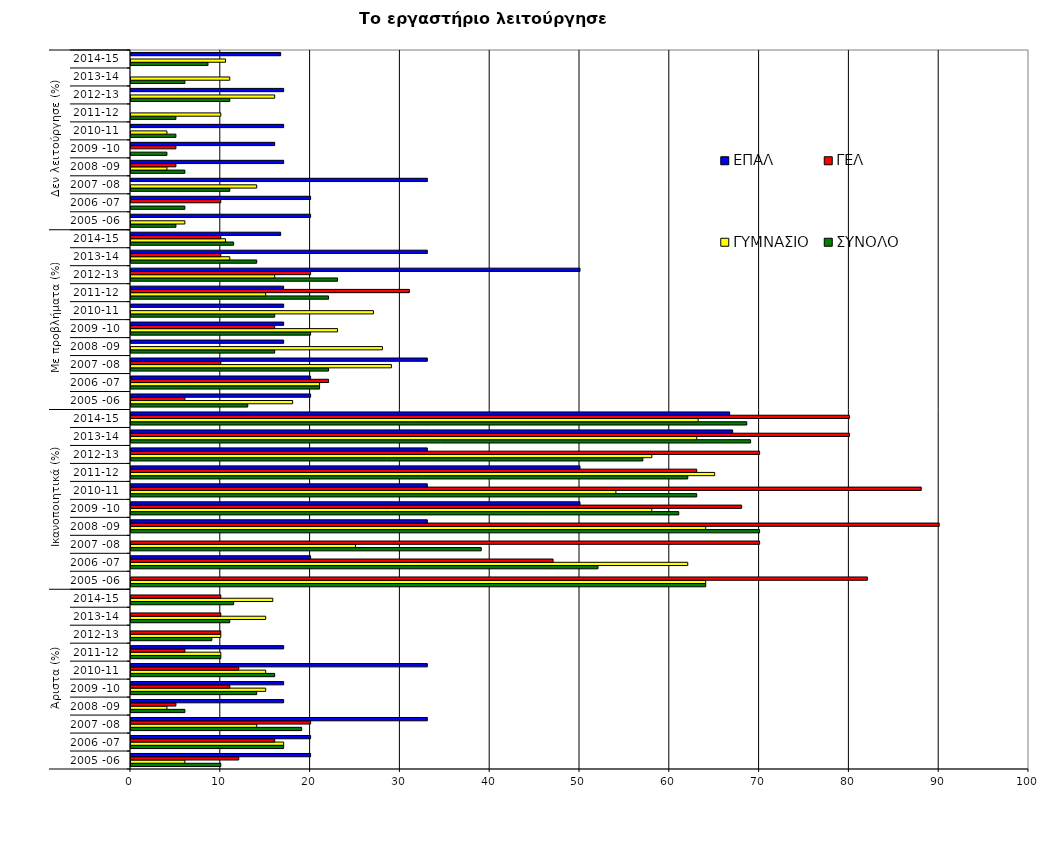
| Category | ΣΥΝΟΛΟ | ΓΥΜΝΑΣΙΟ | ΓΕΛ | ΕΠΑΛ |
|---|---|---|---|---|
| 0 | 10 | 6 | 12 | 20 |
| 1 | 17 | 17 | 16 | 20 |
| 2 | 19 | 14 | 20 | 33 |
| 3 | 6 | 4 | 5 | 17 |
| 4 | 14 | 15 | 11 | 17 |
| 5 | 16 | 15 | 12 | 33 |
| 6 | 10 | 10 | 6 | 17 |
| 7 | 9 | 10 | 10 | 0 |
| 8 | 11 | 15 | 10 | 0 |
| 9 | 11.429 | 15.789 | 10 | 0 |
| 10 | 64 | 64 | 82 | 0 |
| 11 | 52 | 62 | 47 | 20 |
| 12 | 39 | 25 | 70 | 0 |
| 13 | 70 | 64 | 90 | 33 |
| 14 | 61 | 58 | 68 | 50 |
| 15 | 63 | 54 | 88 | 33 |
| 16 | 62 | 65 | 63 | 50 |
| 17 | 57 | 58 | 70 | 33 |
| 18 | 69 | 63 | 80 | 67 |
| 19 | 68.571 | 63.158 | 80 | 66.667 |
| 20 | 13 | 18 | 6 | 20 |
| 21 | 21 | 21 | 22 | 20 |
| 22 | 22 | 29 | 10 | 33 |
| 23 | 16 | 28 | 0 | 17 |
| 24 | 20 | 23 | 16 | 17 |
| 25 | 16 | 27 | 0 | 17 |
| 26 | 22 | 15 | 31 | 17 |
| 27 | 23 | 16 | 20 | 50 |
| 28 | 14 | 11 | 10 | 33 |
| 29 | 11.429 | 10.526 | 10 | 16.667 |
| 30 | 5 | 6 | 0 | 20 |
| 31 | 6 | 0 | 10 | 20 |
| 32 | 11 | 14 | 0 | 33 |
| 33 | 6 | 4 | 5 | 17 |
| 34 | 4 | 0 | 5 | 16 |
| 35 | 5 | 4 | 0 | 17 |
| 36 | 5 | 10 | 0 | 0 |
| 37 | 11 | 16 | 0 | 17 |
| 38 | 6 | 11 | 0 | 0 |
| 39 | 8.571 | 10.526 | 0 | 16.667 |